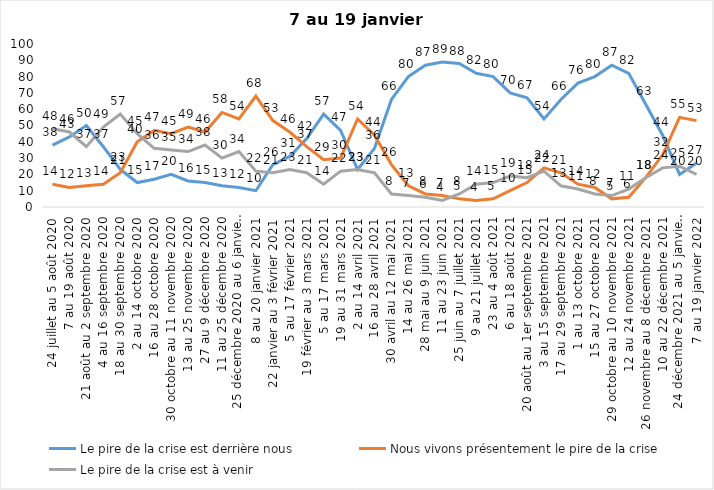
| Category | Le pire de la crise est derrière nous | Nous vivons présentement le pire de la crise | Le pire de la crise est à venir |
|---|---|---|---|
| 24 juillet au 5 août 2020 | 38 | 14 | 48 |
| 7 au 19 août 2020 | 43 | 12 | 46 |
| 21 août au 2 septembre 2020 | 50 | 13 | 37 |
| 4 au 16 septembre 2020 | 37 | 14 | 49 |
| 18 au 30 septembre 2020 | 23 | 21 | 57 |
| 2 au 14 octobre 2020 | 15 | 40 | 45 |
| 16 au 28 octobre 2020 | 17 | 47 | 36 |
| 30 octobre au 11 novembre 2020 | 20 | 45 | 35 |
| 13 au 25 novembre 2020 | 16 | 49 | 34 |
| 27 au 9 décembre 2020 | 15 | 46 | 38 |
| 11 au 25 décembre 2020 | 13 | 58 | 30 |
| 25 décembre 2020 au 6 janvier 2021 | 12 | 54 | 34 |
| 8 au 20 janvier 2021 | 10 | 68 | 22 |
| 22 janvier au 3 février 2021 | 26 | 53 | 21 |
| 5 au 17 février 2021 | 31 | 46 | 23 |
| 19 février au 3 mars 2021 | 42 | 37 | 21 |
| 5 au 17 mars 2021 | 57 | 29 | 14 |
| 19 au 31 mars 2021 | 47 | 30 | 22 |
| 2 au 14 avril 2021 | 23 | 54 | 23 |
| 16 au 28 avril 2021 | 36 | 44 | 21 |
| 30 avril au 12 mai 2021 | 66 | 26 | 8 |
| 14 au 26 mai 2021 | 80 | 13 | 7 |
| 28 mai au 9 juin 2021 | 87 | 8 | 6 |
| 11 au 23 juin 2021 | 89 | 7 | 4 |
| 25 juin au 7 juillet 2021 | 88 | 5 | 8 |
| 9 au 21 juillet 2021 | 82 | 4 | 14 |
| 23 au 4 août 2021 | 80 | 5 | 15 |
| 6 au 18 août 2021 | 70 | 10 | 19 |
| 20 août au 1er septembre 2021 | 67 | 15 | 18 |
| 3 au 15 septembre 2021 | 54 | 24 | 22 |
| 17 au 29 septembre 2021 | 66 | 21 | 13 |
| 1 au 13 octobre 2021 | 76 | 14 | 11 |
| 15 au 27 octobre 2021 | 80 | 12 | 8 |
| 29 octobre au 10 novembre 2021 | 87 | 5 | 7 |
| 12 au 24 novembre 2021 | 82 | 6 | 11 |
| 26 novembre au 8 décembre 2021 | 63 | 18 | 18 |
| 10 au 22 décembre 2021 | 44 | 32 | 24 |
| 24 décembre 2021 au 5 janvier 2022 2022 | 20 | 55 | 25 |
| 7 au 19 janvier 2022 | 27 | 53 | 20 |